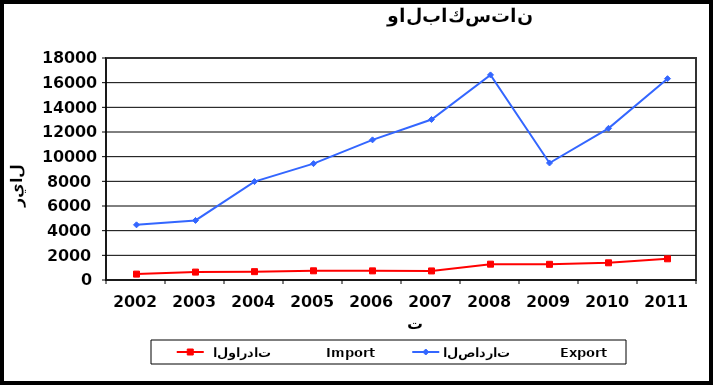
| Category |  الواردات           Import | الصادرات          Export |
|---|---|---|
| 2002.0 | 477 | 4474 |
| 2003.0 | 642 | 4828 |
| 2004.0 | 677 | 7979 |
| 2005.0 | 746 | 9435 |
| 2006.0 | 741 | 11363 |
| 2007.0 | 734 | 13015 |
| 2008.0 | 1283 | 16630 |
| 2009.0 | 1271 | 9487 |
| 2010.0 | 1394 | 12298 |
| 2011.0 | 1719 | 16323 |